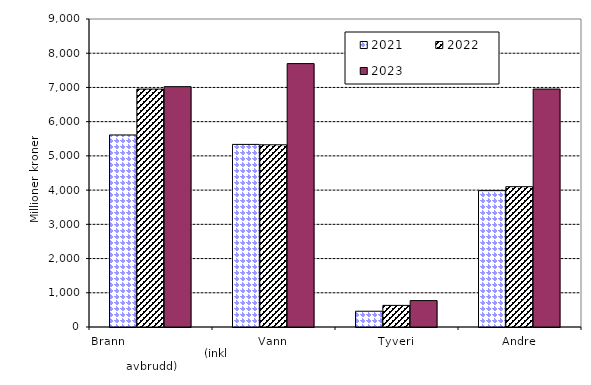
| Category | 2021 | 2022 | 2023 |
|---|---|---|---|
| Brann                                                       (inkl avbrudd) | 5611.316 | 6952.119 | 7022.737 |
| Vann | 5335.101 | 5324.25 | 7696.74 |
| Tyveri | 460.479 | 631.07 | 771.563 |
| Andre | 3984.789 | 4100.178 | 6953.165 |